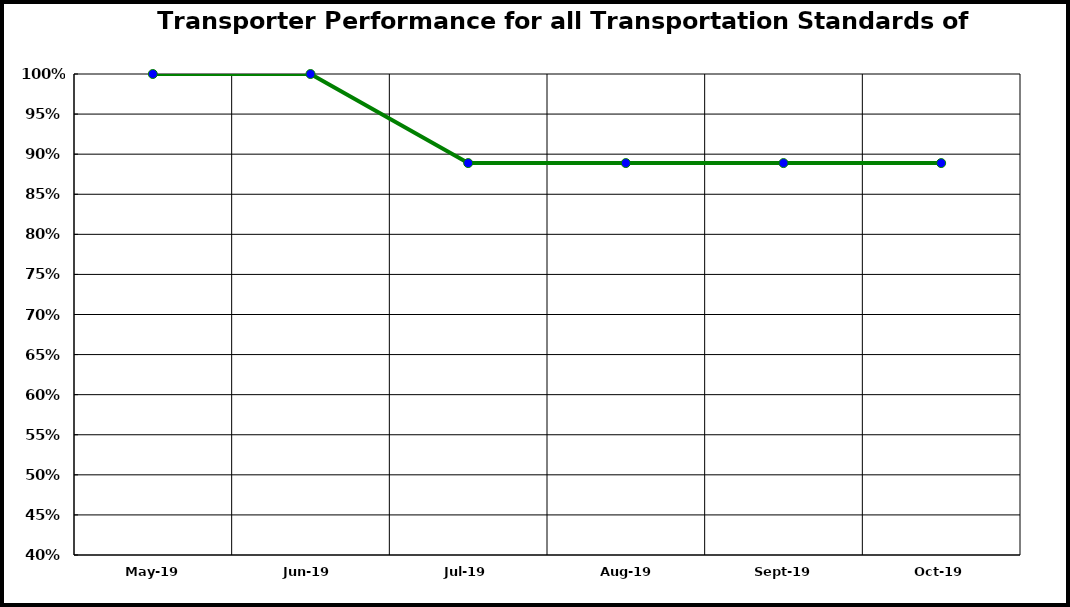
| Category | Performance |
|---|---|
| 2019-05-01 | 1 |
| 2019-06-01 | 1 |
| 2019-07-01 | 0.889 |
| 2019-08-01 | 0.889 |
| 2019-09-01 | 0.889 |
| 2019-10-01 | 0.889 |